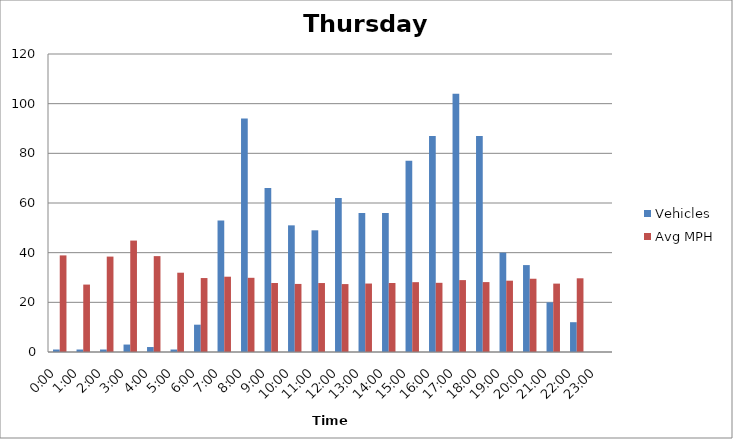
| Category | Vehicles | Avg MPH |
|---|---|---|
| 0:00 | 1 | 38.9 |
| 1:00 | 1 | 27.15 |
| 2:00 | 1 | 38.42 |
| 3:00 | 3 | 44.87 |
| 4:00 | 2 | 38.61 |
| 5:00 | 1 | 31.93 |
| 6:00 | 11 | 29.78 |
| 7:00 | 53 | 30.32 |
| 8:00 | 94 | 29.88 |
| 9:00 | 66 | 27.79 |
| 10:00 | 51 | 27.41 |
| 11:00 | 49 | 27.77 |
| 12:00 | 62 | 27.35 |
| 13:00 | 56 | 27.57 |
| 14:00 | 56 | 27.78 |
| 15:00 | 77 | 28.12 |
| 16:00 | 87 | 27.86 |
| 17:00 | 104 | 28.95 |
| 18:00 | 87 | 28.15 |
| 19:00 | 40 | 28.72 |
| 20:00 | 35 | 29.5 |
| 21:00 | 20 | 27.54 |
| 22:00 | 12 | 29.68 |
| 23:00 | 0 | 0 |